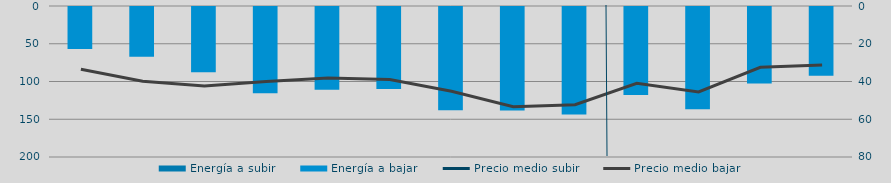
| Category | Energía a subir | Energía a bajar |
|---|---|---|
| D |  | 56832.525 |
| E |  | 67245.511 |
| F |  | 87837.741 |
| M |  | 115472.265 |
| A |  | 110945.08 |
| M |  | 109933.033 |
| J |  | 138127.981 |
| J |  | 138345.883 |
| A |  | 143556.525 |
| S |  | 118042.065 |
| O |  | 136637.182 |
| N |  | 102576.868 |
| D |  | 92295.144 |